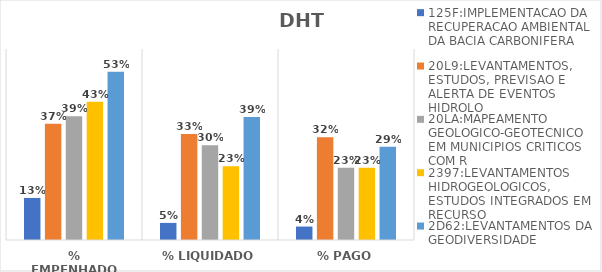
| Category | 125F:IMPLEMENTACAO DA RECUPERACAO AMBIENTAL DA BACIA CARBONIFERA | 20L9:LEVANTAMENTOS, ESTUDOS, PREVISAO E ALERTA DE EVENTOS HIDROLO | 20LA:MAPEAMENTO GEOLOGICO-GEOTECNICO EM MUNICIPIOS CRITICOS COM R | 2397:LEVANTAMENTOS HIDROGEOLOGICOS, ESTUDOS INTEGRADOS EM RECURSO | 2D62:LEVANTAMENTOS DA GEODIVERSIDADE |
|---|---|---|---|---|---|
| % EMPENHADO | 0.132 | 0.366 | 0.389 | 0.434 | 0.528 |
| % LIQUIDADO | 0.054 | 0.333 | 0.298 | 0.231 | 0.386 |
| % PAGO | 0.042 | 0.323 | 0.227 | 0.227 | 0.293 |